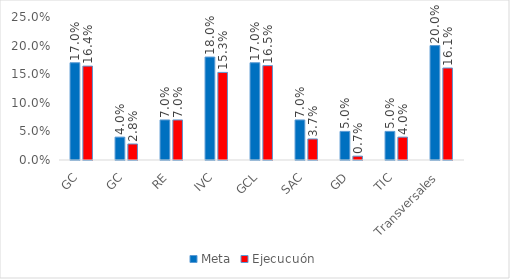
| Category | Meta | Ejecucuón |
|---|---|---|
| GC | 0.17 | 0.164 |
| GC | 0.04 | 0.028 |
| RE | 0.07 | 0.07 |
| IVC | 0.18 | 0.153 |
| GCL | 0.17 | 0.165 |
| SAC | 0.07 | 0.037 |
| GD | 0.05 | 0.007 |
| TIC | 0.05 | 0.04 |
| Transversales | 0.2 | 0.161 |